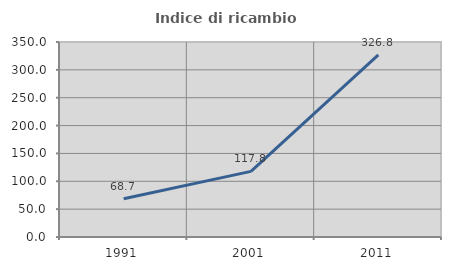
| Category | Indice di ricambio occupazionale  |
|---|---|
| 1991.0 | 68.675 |
| 2001.0 | 117.773 |
| 2011.0 | 326.816 |